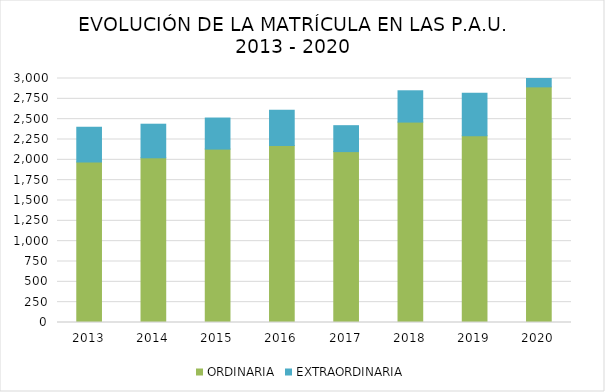
| Category | ORDINARIA | EXTRAORDINARIA |
|---|---|---|
| 2013.0 | 1973 | 429 |
| 2014.0 | 2025 | 413 |
| 2015.0 | 2132 | 382 |
| 2016.0 | 2177 | 432 |
| 2017.0 | 2101 | 319 |
| 2018.0 | 2464 | 385 |
| 2019.0 | 2296 | 524 |
| 2020.0 | 2897 | 203 |